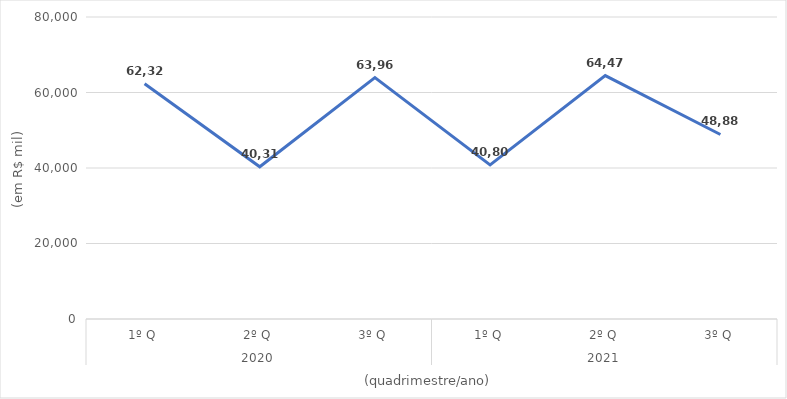
| Category | Total (deflacionado) |
|---|---|
| 0 | 62322452.864 |
| 1 | 40316684.352 |
| 2 | 63966064.275 |
| 3 | 40803752.202 |
| 4 | 64471359.454 |
| 5 | 48880129.54 |